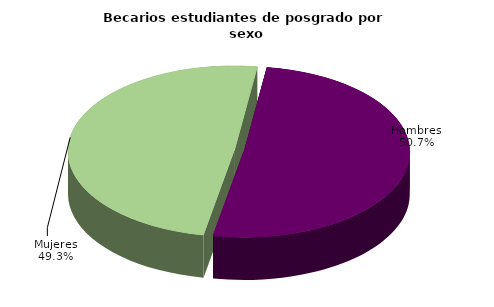
| Category | Series 0 |
|---|---|
| Hombres | 14765 |
| Mujeres | 14344 |